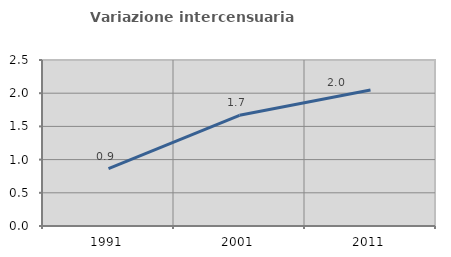
| Category | Variazione intercensuaria annua |
|---|---|
| 1991.0 | 0.866 |
| 2001.0 | 1.667 |
| 2011.0 | 2.049 |